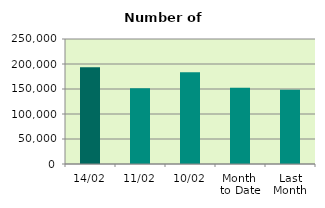
| Category | Series 0 |
|---|---|
| 14/02 | 193604 |
| 11/02 | 151450 |
| 10/02 | 183570 |
| Month 
to Date | 152417.4 |
| Last
Month | 148479.905 |